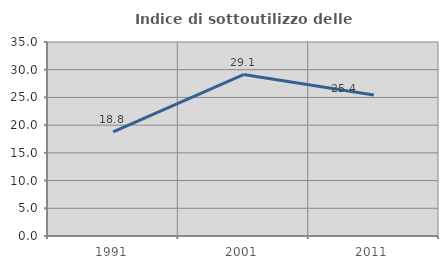
| Category | Indice di sottoutilizzo delle abitazioni  |
|---|---|
| 1991.0 | 18.803 |
| 2001.0 | 29.134 |
| 2011.0 | 25.424 |